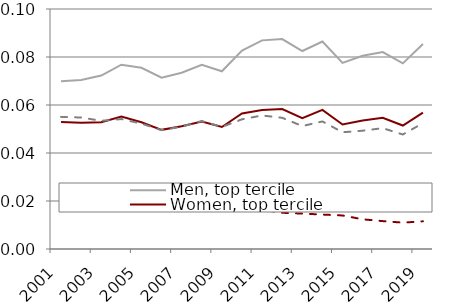
| Category | Men, top tercile | Women, top tercile | Men, bottom tercile | Women, bottom tercile |
|---|---|---|---|---|
| 2001.0 | 0.07 | 0.053 | 0.055 | 0.021 |
| 2002.0 | 0.07 | 0.053 | 0.055 | 0.021 |
| 2003.0 | 0.072 | 0.053 | 0.053 | 0.019 |
| 2004.0 | 0.077 | 0.055 | 0.054 | 0.019 |
| 2005.0 | 0.076 | 0.053 | 0.052 | 0.017 |
| 2006.0 | 0.071 | 0.05 | 0.05 | 0.016 |
| 2007.0 | 0.073 | 0.051 | 0.051 | 0.016 |
| 2008.0 | 0.077 | 0.053 | 0.053 | 0.019 |
| 2009.0 | 0.074 | 0.051 | 0.051 | 0.018 |
| 2010.0 | 0.083 | 0.056 | 0.054 | 0.016 |
| 2011.0 | 0.087 | 0.058 | 0.056 | 0.016 |
| 2012.0 | 0.087 | 0.058 | 0.055 | 0.015 |
| 2013.0 | 0.082 | 0.055 | 0.051 | 0.015 |
| 2014.0 | 0.086 | 0.058 | 0.053 | 0.014 |
| 2015.0 | 0.078 | 0.052 | 0.049 | 0.014 |
| 2016.0 | 0.08 | 0.054 | 0.049 | 0.012 |
| 2017.0 | 0.082 | 0.055 | 0.05 | 0.012 |
| 2018.0 | 0.077 | 0.051 | 0.048 | 0.011 |
| 2019.0 | 0.085 | 0.057 | 0.052 | 0.012 |